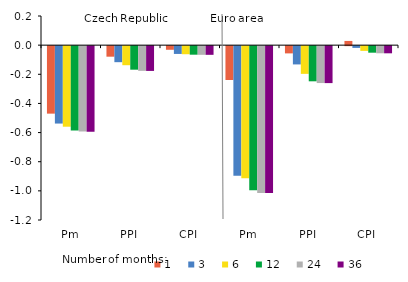
| Category | 1 | 3 | 6 | 12 | 24 | 36 |
|---|---|---|---|---|---|---|
| Pm | -0.463 | -0.531 | -0.553 | -0.579 | -0.587 | -0.587 |
| PPI | -0.072 | -0.11 | -0.131 | -0.162 | -0.17 | -0.17 |
| CPI | -0.025 | -0.053 | -0.055 | -0.059 | -0.06 | -0.06 |
| Pm | -0.232 | -0.89 | -0.906 | -0.988 | -1.008 | -1.008 |
| PPI | -0.05 | -0.125 | -0.19 | -0.241 | -0.253 | -0.254 |
| CPI | 0.029 | -0.012 | -0.033 | -0.045 | -0.049 | -0.049 |